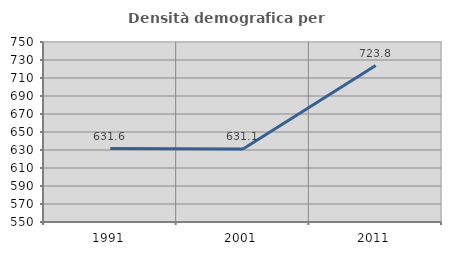
| Category | Densità demografica |
|---|---|
| 1991.0 | 631.552 |
| 2001.0 | 631.124 |
| 2011.0 | 723.832 |